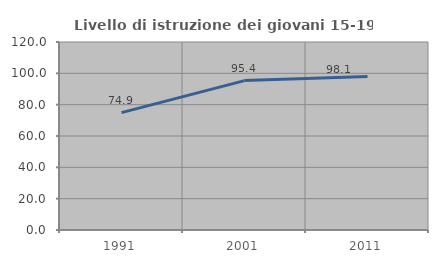
| Category | Livello di istruzione dei giovani 15-19 anni |
|---|---|
| 1991.0 | 74.94 |
| 2001.0 | 95.372 |
| 2011.0 | 98.054 |